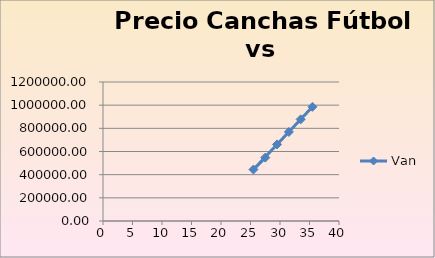
| Category | Van |
|---|---|
| 27.5 | 547148.43 |
| 25.5 | 444249.197 |
| 29.5 | 660856.94 |
| 31.5 | 769160.811 |
| 33.5 | 877464.683 |
| 35.5 | 985768.554 |